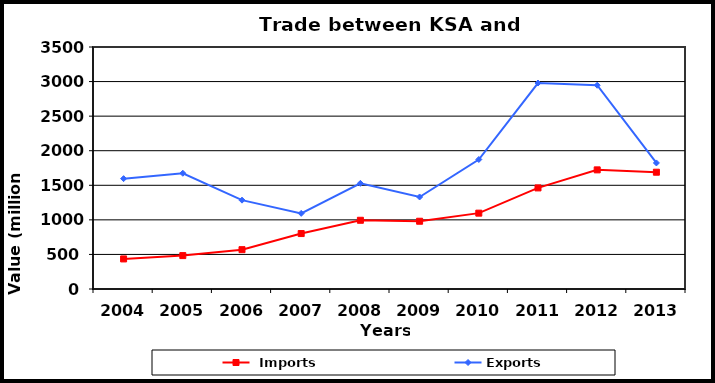
| Category |  Imports | Exports |
|---|---|---|
| 2004.0 | 435 | 1596 |
| 2005.0 | 483 | 1674 |
| 2006.0 | 569 | 1285 |
| 2007.0 | 802 | 1094 |
| 2008.0 | 994 | 1528 |
| 2009.0 | 980 | 1331 |
| 2010.0 | 1097 | 1873 |
| 2011.0 | 1462 | 2979 |
| 2012.0 | 1723 | 2947 |
| 2013.0 | 1689 | 1823 |